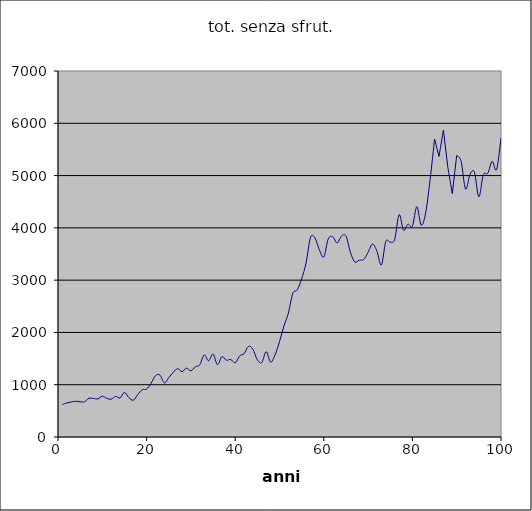
| Category | tot. senza sfrut. |
|---|---|
| 0 | 619.847 |
| 1 | 651.251 |
| 2 | 669.785 |
| 3 | 684.507 |
| 4 | 673.703 |
| 5 | 675.761 |
| 6 | 741.015 |
| 7 | 736.977 |
| 8 | 728.854 |
| 9 | 779.505 |
| 10 | 739.935 |
| 11 | 723.353 |
| 12 | 778.288 |
| 13 | 746.935 |
| 14 | 853.966 |
| 15 | 752.901 |
| 16 | 703.632 |
| 17 | 811.587 |
| 18 | 903.142 |
| 19 | 916.358 |
| 20 | 1025.938 |
| 21 | 1171.299 |
| 22 | 1185.116 |
| 23 | 1036.418 |
| 24 | 1135.122 |
| 25 | 1234.851 |
| 26 | 1306.468 |
| 27 | 1249.145 |
| 28 | 1317.192 |
| 29 | 1265.426 |
| 30 | 1342.266 |
| 31 | 1381.53 |
| 32 | 1568.596 |
| 33 | 1458.15 |
| 34 | 1586.335 |
| 35 | 1384.758 |
| 36 | 1537.89 |
| 37 | 1468.512 |
| 38 | 1482.957 |
| 39 | 1417.626 |
| 40 | 1550.022 |
| 41 | 1594.698 |
| 42 | 1734.866 |
| 43 | 1676.472 |
| 44 | 1475.428 |
| 45 | 1425.037 |
| 46 | 1632.32 |
| 47 | 1433.218 |
| 48 | 1571.344 |
| 49 | 1825.37 |
| 50 | 2122.31 |
| 51 | 2369.121 |
| 52 | 2747.142 |
| 53 | 2814.635 |
| 54 | 3025.704 |
| 55 | 3332.233 |
| 56 | 3818.654 |
| 57 | 3804.979 |
| 58 | 3579.23 |
| 59 | 3444.401 |
| 60 | 3788.312 |
| 61 | 3830.792 |
| 62 | 3712.253 |
| 63 | 3843.379 |
| 64 | 3845.271 |
| 65 | 3534.391 |
| 66 | 3347.055 |
| 67 | 3382.791 |
| 68 | 3393.058 |
| 69 | 3534.674 |
| 70 | 3691.568 |
| 71 | 3552.11 |
| 72 | 3290.15 |
| 73 | 3740.765 |
| 74 | 3726.812 |
| 75 | 3778.865 |
| 76 | 4253.342 |
| 77 | 3955.097 |
| 78 | 4069.5 |
| 79 | 4028.186 |
| 80 | 4406.026 |
| 81 | 4050.243 |
| 82 | 4293.868 |
| 83 | 4924.204 |
| 84 | 5698.857 |
| 85 | 5365.897 |
| 86 | 5870.839 |
| 87 | 5159.409 |
| 88 | 4656.244 |
| 89 | 5384.079 |
| 90 | 5269.984 |
| 91 | 4742.363 |
| 92 | 5021.293 |
| 93 | 5064.647 |
| 94 | 4593.427 |
| 95 | 5015.873 |
| 96 | 5041.53 |
| 97 | 5273.647 |
| 98 | 5113.914 |
| 99 | 5724.422 |